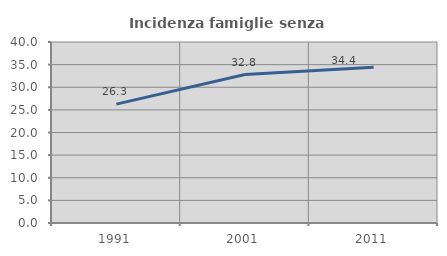
| Category | Incidenza famiglie senza nuclei |
|---|---|
| 1991.0 | 26.266 |
| 2001.0 | 32.813 |
| 2011.0 | 34.442 |